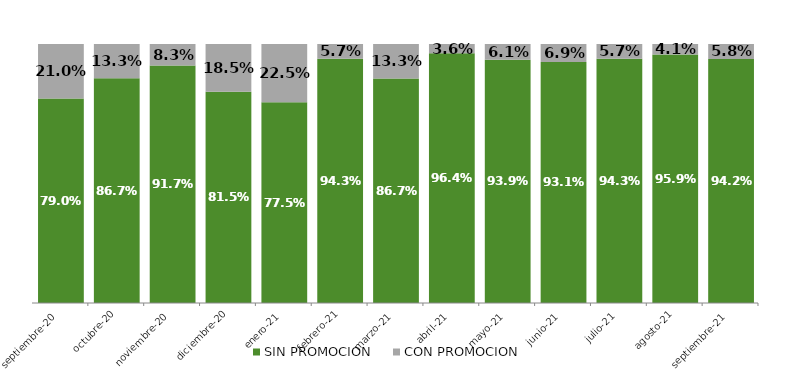
| Category | SIN PROMOCION   | CON PROMOCION   |
|---|---|---|
| 2020-09-01 | 0.79 | 0.21 |
| 2020-10-01 | 0.867 | 0.133 |
| 2020-11-01 | 0.917 | 0.083 |
| 2020-12-01 | 0.815 | 0.185 |
| 2021-01-01 | 0.775 | 0.225 |
| 2021-02-01 | 0.943 | 0.057 |
| 2021-03-01 | 0.867 | 0.133 |
| 2021-04-01 | 0.964 | 0.036 |
| 2021-05-01 | 0.939 | 0.061 |
| 2021-06-01 | 0.931 | 0.069 |
| 2021-07-01 | 0.943 | 0.057 |
| 2021-08-01 | 0.959 | 0.041 |
| 2021-09-01 | 0.942 | 0.058 |